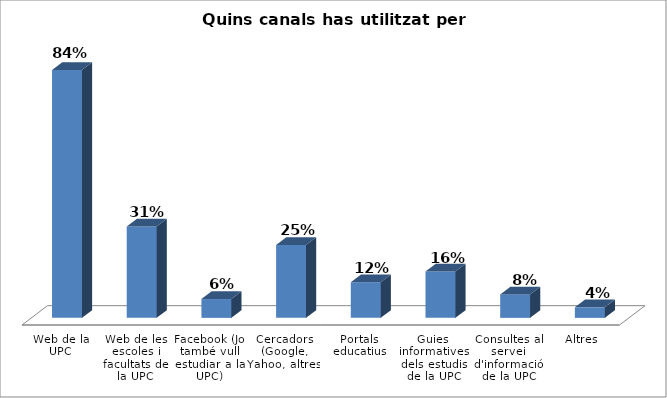
| Category | Series 0 |
|---|---|
| Web de la UPC | 0.839 |
| Web de les escoles i facultats de la UPC | 0.31 |
| Facebook (Jo també vull estudiar a la UPC) | 0.064 |
| Cercadors (Google, Yahoo, altres) | 0.247 |
| Portals educatius | 0.121 |
| Guies informatives dels estudis de la UPC | 0.157 |
| Consultes al servei d'informació de la UPC | 0.08 |
| Altres | 0.036 |